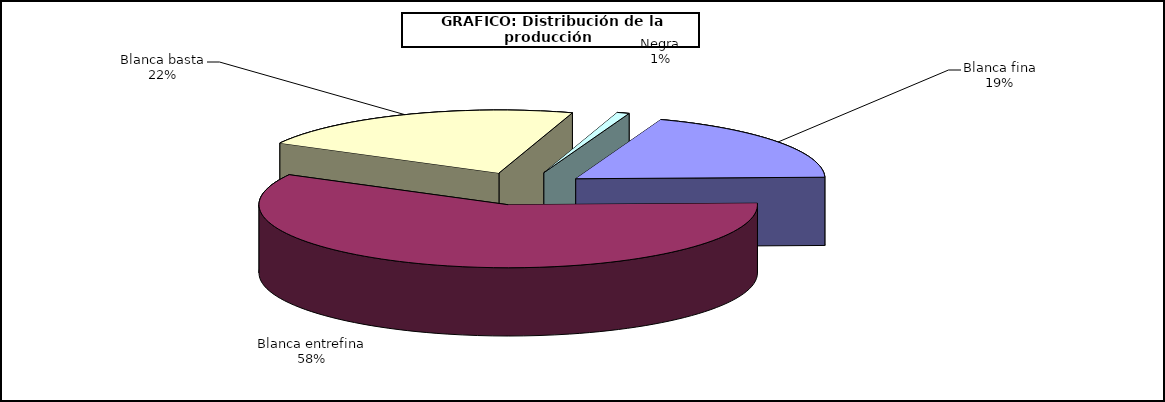
| Category | Series 0 |
|---|---|
| 0 | 4179.234 |
| 1 | 12784.481 |
| 2 | 4791.627 |
| 3 | 174.304 |